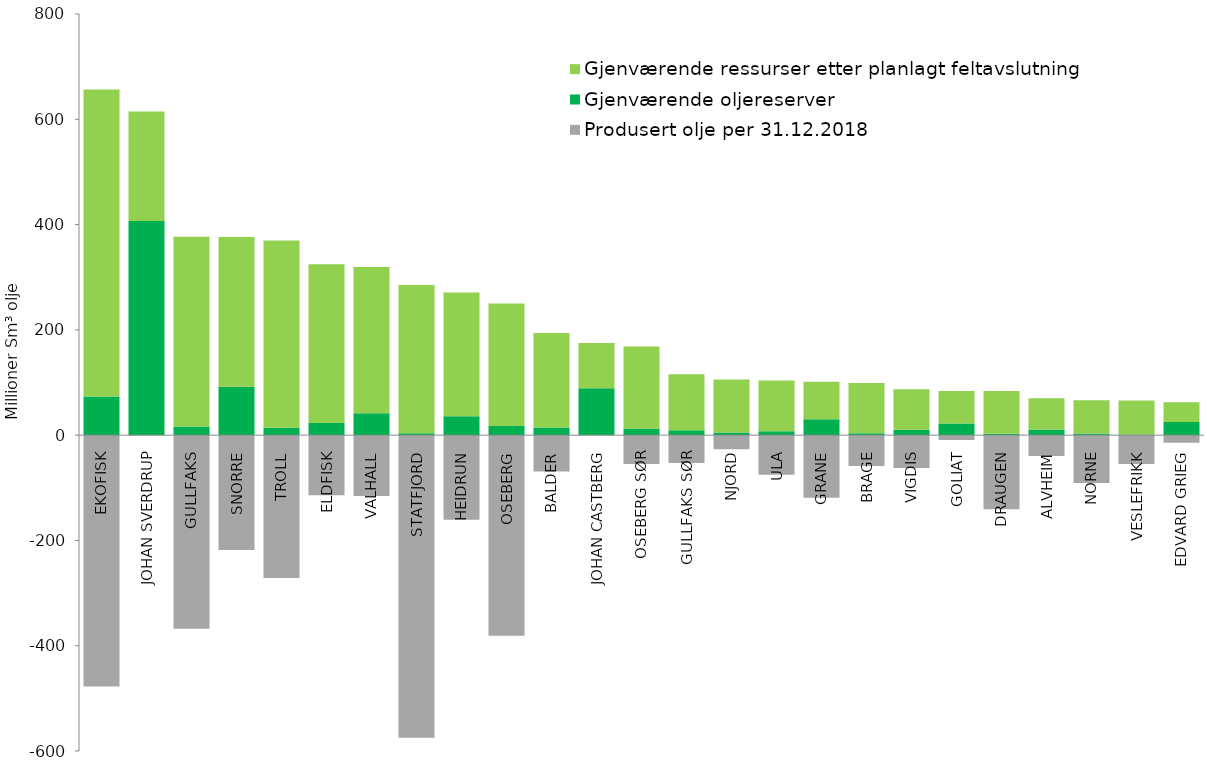
| Category | Produsert olje per 31.12.2018 | Gjenværende oljereserver | Gjenværende ressurser etter planlagt feltavslutning |
|---|---|---|---|
| EKOFISK | -477.7 | 73.42 | 583.08 |
| JOHAN SVERDRUP | 0 | 406.58 | 208.42 |
| GULLFAKS | -367.74 | 16.25 | 360.61 |
| SNORRE | -218.27 | 91.78 | 284.63 |
| TROLL | -271.59 | 14.11 | 355.8 |
| ELDFISK | -114.41 | 23.04 | 301.36 |
| VALHALL | -115.73 | 41.37 | 278.11 |
| STATFJORD | -574.78 | 3.65 | 281.39 |
| HEIDRUN | -160.81 | 35.74 | 235.45 |
| OSEBERG | -381.09 | 17.52 | 232.69 |
| BALDER | -69.09 | 14.64 | 179.47 |
| JOHAN CASTBERG | 0 | 88.9 | 86.34 |
| OSEBERG SØR | -54.71 | 12 | 156.29 |
| GULLFAKS SØR | -52.84 | 9.41 | 106.03 |
| NJORD | -26.65 | 4.85 | 100.69 |
| ULA | -75.4 | 7.51 | 96.43 |
| GRANE | -118.81 | 29.98 | 71.21 |
| BRAGE | -58.83 | 3.59 | 95.38 |
| VIGDIS | -62.61 | 10.25 | 76.94 |
| GOLIAT | -9.21 | 22.24 | 61.65 |
| DRAUGEN | -140.62 | 2.62 | 81.16 |
| ALVHEIM | -39.6 | 10.74 | 59.16 |
| NORNE | -90.78 | 3.04 | 63.18 |
| VESLEFRIKK | -54.79 | 1.36 | 64.41 |
| EDVARD GRIEG | -14.32 | 25.15 | 37.53 |